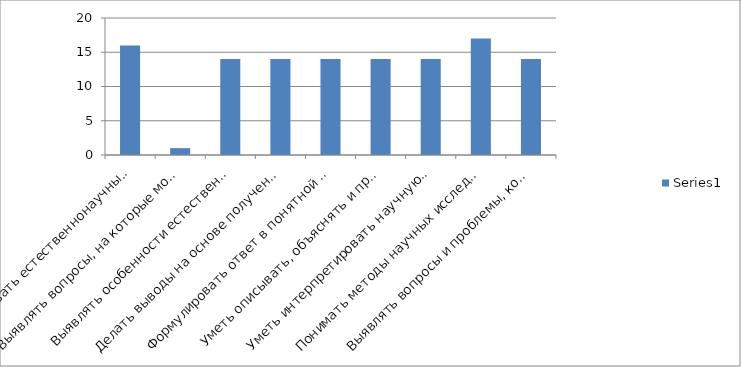
| Category | Series 0 |
|---|---|
| Использовать естественнонаучные знания в жизненных ситуациях; | 16 |
| Выявлять вопросы, на которые может ответить естествознание; | 1 |
| Выявлять особенности естественнонаучного исследования | 14 |
| Делать выводы на основе полученных данных | 14 |
| Формулировать ответ в понятной для всех форме | 14 |
| Уметь описывать, объяснять и прогнозировать естественнонаучные явления | 14 |
| Уметь интерпретировать научную аргументацию и выводы, с которыми они могут встретиться в средствах массовой информации | 14 |
| Понимать методы научных исследований | 17 |
| Выявлять вопросы и проблемы, которые могут быть решены с помощью научных методов. | 14 |